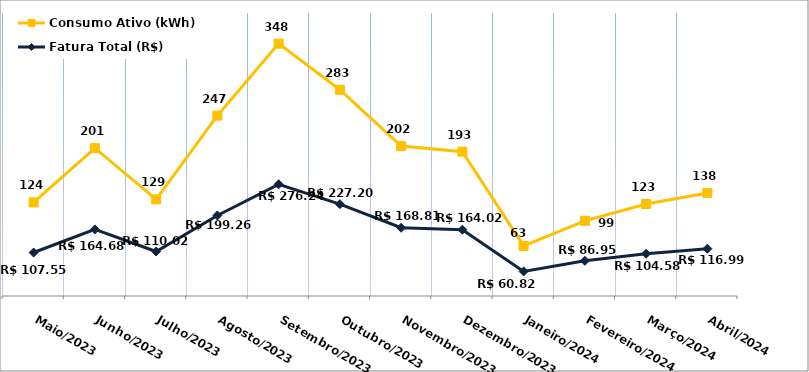
| Category | Fatura Total (R$) | Consumo Ativo (kWh) |
|---|---|---|
| Maio/2023 | 107.55 | 124 |
| Junho/2023 | 164.68 | 201 |
| Julho/2023 | 110.02 | 129 |
| Agosto/2023 | 199.26 | 247 |
| Setembro/2023 | 276.24 | 348 |
| Outubro/2023 | 227.2 | 283 |
| Novembro/2023 | 168.81 | 202 |
| Dezembro/2023 | 164.02 | 193 |
| Janeiro/2024 | 60.82 | 63 |
| Fevereiro/2024 | 86.95 | 99 |
| Março/2024 | 104.58 | 123 |
| Abril/2024 | 116.99 | 138 |